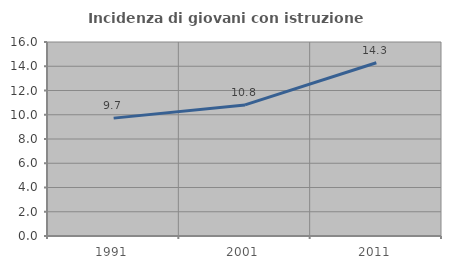
| Category | Incidenza di giovani con istruzione universitaria |
|---|---|
| 1991.0 | 9.722 |
| 2001.0 | 10.811 |
| 2011.0 | 14.286 |